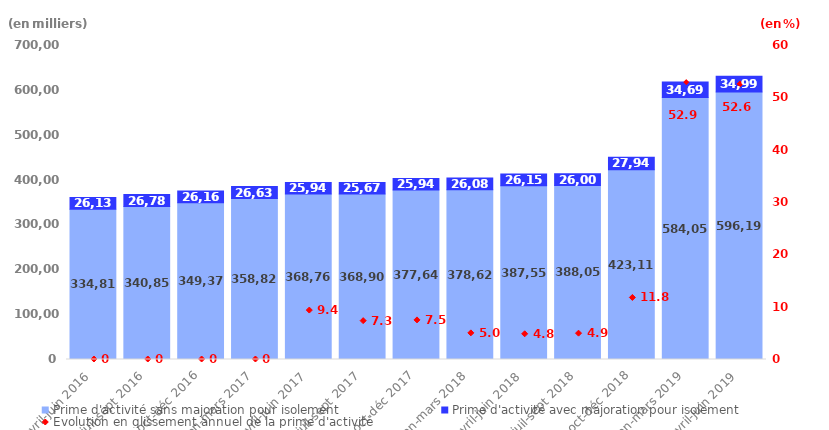
| Category | Prime d'activité sans majoration pour isolement | Prime d'activité avec majoration pour isolement |
|---|---|---|
| avril-juin 2016 | 334816 | 26136 |
| juil-sept 2016 | 340856 | 26782 |
| oct-déc 2016 | 349372 | 26166 |
| jan-mars 2017 | 358825 | 26630 |
| avril-juin 2017 | 368765 | 25940 |
| juil-sept 2017 | 368904 | 25679 |
| oct-déc 2017 | 377647 | 25949 |
| jan-mars 2018 | 378622 | 26083 |
| avril-juin 2018 | 387552 | 26159 |
| juil-sept 2018 | 388059 | 26002 |
| oct-déc 2018 | 423119 | 27946 |
| jan-mars 2019 | 584050 | 34694 |
| avril-juin 2019 | 596195 | 34995 |